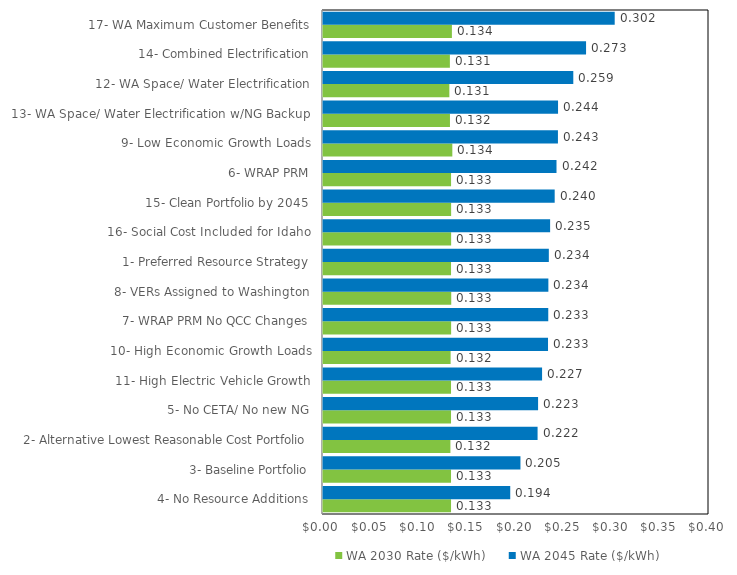
| Category | WA 2030 Rate ($/kWh) | WA 2045 Rate ($/kWh) |
|---|---|---|
| 4- No Resource Additions | 0.133 | 0.194 |
| 3- Baseline Portfolio | 0.133 | 0.205 |
| 2- Alternative Lowest Reasonable Cost Portfolio | 0.132 | 0.222 |
| 5- No CETA/ No new NG | 0.133 | 0.223 |
| 11- High Electric Vehicle Growth | 0.133 | 0.227 |
| 10- High Economic Growth Loads | 0.132 | 0.233 |
| 7- WRAP PRM No QCC Changes | 0.133 | 0.233 |
| 8- VERs Assigned to Washington | 0.133 | 0.234 |
| 1- Preferred Resource Strategy | 0.133 | 0.234 |
| 16- Social Cost Included for Idaho | 0.133 | 0.235 |
| 15- Clean Portfolio by 2045 | 0.133 | 0.24 |
| 6- WRAP PRM | 0.133 | 0.242 |
| 9- Low Economic Growth Loads | 0.134 | 0.243 |
| 13- WA Space/ Water Electrification w/NG Backup | 0.132 | 0.244 |
| 12- WA Space/ Water Electrification | 0.131 | 0.259 |
| 14- Combined Electrification | 0.131 | 0.273 |
| 17- WA Maximum Customer Benefits | 0.134 | 0.302 |